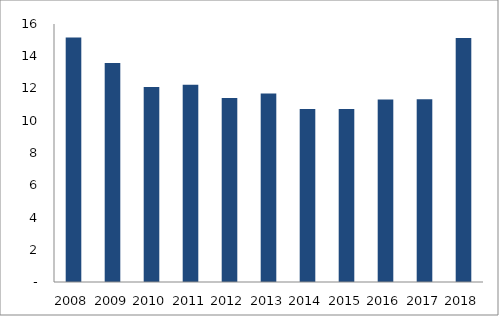
| Category | Series 0 |
|---|---|
| 2008.0 | 15.169 |
| 2009.0 | 13.587 |
| 2010.0 | 12.093 |
| 2011.0 | 12.238 |
| 2012.0 | 11.411 |
| 2013.0 | 11.688 |
| 2014.0 | 10.722 |
| 2015.0 | 10.736 |
| 2016.0 | 11.312 |
| 2017.0 | 11.332 |
| 2018.0 | 15.125 |